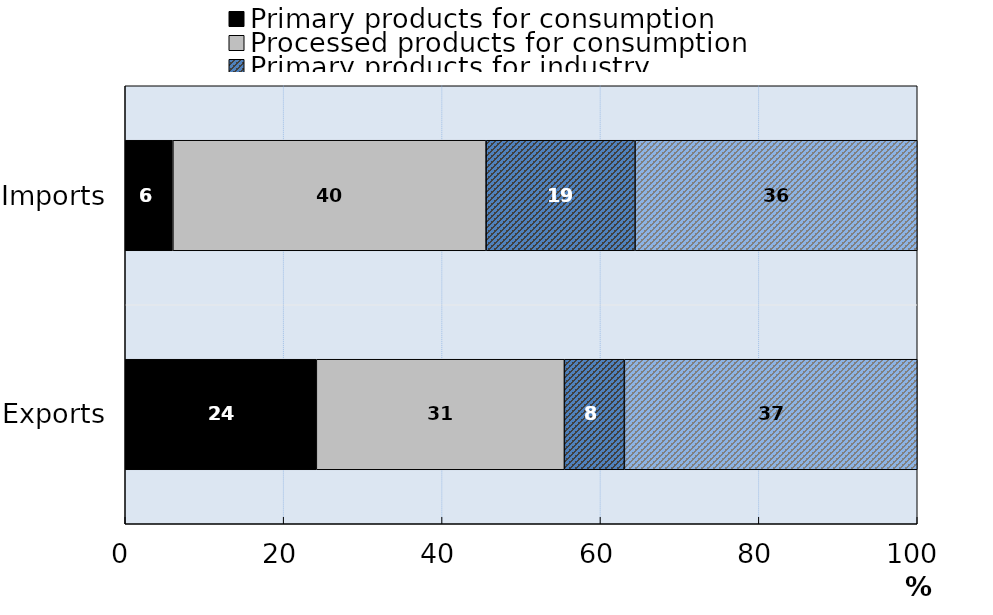
| Category | Primary products for consumption | Processed products for consumption | Primary products for industry | Processed products for industry |
|---|---|---|---|---|
| Exports | 24.126 | 31.321 | 7.573 | 36.979 |
| Imports | 6.013 | 39.549 | 18.81 | 35.628 |